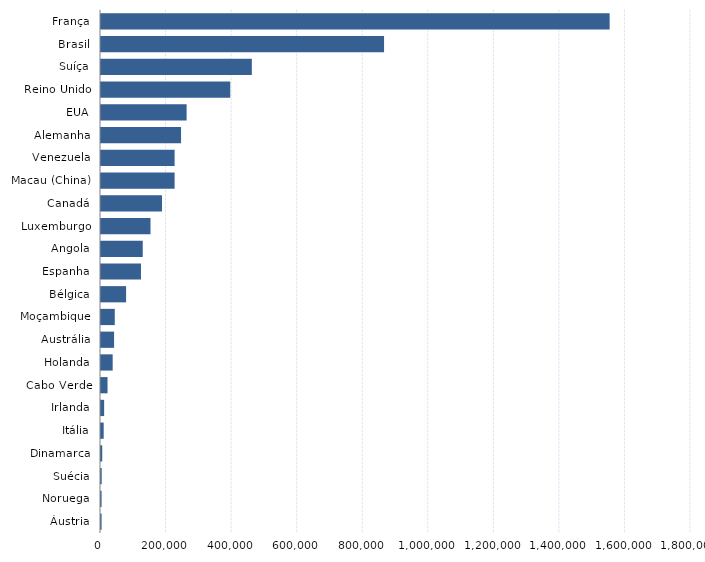
| Category | Series 0 |
|---|---|
| Áustria | 1768 |
| Noruega | 1799 |
| Suécia | 2125 |
| Dinamarca | 3766 |
| Itália | 8189 |
| Irlanda | 9542 |
| Cabo Verde | 19937 |
| Holanda | 35633 |
| Austrália | 39909 |
| Moçambique | 42008 |
| Bélgica | 76587 |
| Espanha | 121939 |
| Angola | 127366 |
| Luxemburgo | 151028 |
| Canadá | 186065 |
| Macau (China) | 224579 |
| Venezuela | 224579 |
| Alemanha | 244217 |
| EUA | 261203 |
| Reino Unido | 394352 |
| Suíça | 460173 |
| Brasil | 863592 |
| França | 1551776 |